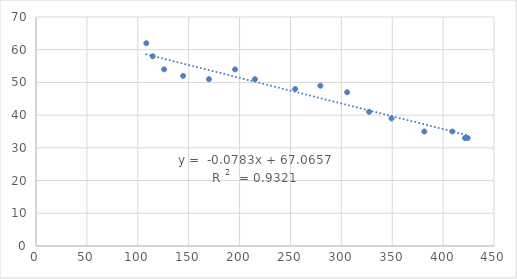
| Category | Series 0 |
|---|---|
| 108.376 | 62 |
| 114.69 | 58 |
| 125.874 | 54 |
| 144.56 | 52 |
| 169.94 | 51 |
| 195.586 | 54 |
| 215.115 | 51 |
| 254.693 | 48 |
| 279.397 | 49 |
| 305.702 | 47 |
| 327.289 | 41 |
| 349.301 | 39 |
| 381.56 | 35 |
| 409.075 | 35 |
| 421.52 | 33 |
| 424.161 | 33 |